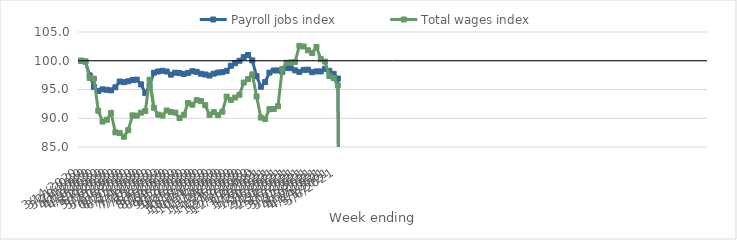
| Category | Payroll jobs index | Total wages index |
|---|---|---|
| 14/03/2020 | 100 | 100 |
| 21/03/2020 | 99.853 | 99.878 |
| 28/03/2020 | 97.447 | 96.996 |
| 04/04/2020 | 95.452 | 96.903 |
| 11/04/2020 | 94.746 | 91.31 |
| 18/04/2020 | 95.023 | 89.423 |
| 25/04/2020 | 94.951 | 89.736 |
| 02/05/2020 | 94.848 | 90.915 |
| 09/05/2020 | 95.383 | 87.552 |
| 16/05/2020 | 96.383 | 87.419 |
| 23/05/2020 | 96.278 | 86.781 |
| 30/05/2020 | 96.426 | 87.936 |
| 06/06/2020 | 96.658 | 90.496 |
| 13/06/2020 | 96.719 | 90.455 |
| 20/06/2020 | 95.897 | 90.972 |
| 27/06/2020 | 94.369 | 91.252 |
| 04/07/2020 | 95.674 | 96.707 |
| 11/07/2020 | 97.921 | 91.822 |
| 18/07/2020 | 98.134 | 90.632 |
| 25/07/2020 | 98.254 | 90.469 |
| 01/08/2020 | 98.123 | 91.344 |
| 08/08/2020 | 97.587 | 91.09 |
| 15/08/2020 | 97.924 | 90.979 |
| 22/08/2020 | 97.852 | 90.042 |
| 29/08/2020 | 97.711 | 90.594 |
| 05/09/2020 | 97.883 | 92.665 |
| 12/09/2020 | 98.179 | 92.354 |
| 19/09/2020 | 98.065 | 93.158 |
| 26/09/2020 | 97.737 | 93.002 |
| 03/10/2020 | 97.616 | 92.274 |
| 10/10/2020 | 97.427 | 90.592 |
| 17/10/2020 | 97.758 | 91.07 |
| 24/10/2020 | 97.948 | 90.548 |
| 31/10/2020 | 98.018 | 91.136 |
| 07/11/2020 | 98.229 | 93.765 |
| 14/11/2020 | 99.131 | 93.198 |
| 21/11/2020 | 99.566 | 93.607 |
| 28/11/2020 | 99.997 | 94.08 |
| 05/12/2020 | 100.629 | 96.211 |
| 12/12/2020 | 100.998 | 96.81 |
| 19/12/2020 | 100.053 | 97.638 |
| 26/12/2020 | 97.318 | 93.794 |
| 02/01/2021 | 95.472 | 90.121 |
| 09/01/2021 | 96.306 | 89.875 |
| 16/01/2021 | 97.939 | 91.581 |
| 23/01/2021 | 98.307 | 91.606 |
| 30/01/2021 | 98.313 | 92.076 |
| 06/02/2021 | 98.079 | 98.581 |
| 13/02/2021 | 98.755 | 99.647 |
| 20/02/2021 | 98.702 | 99.706 |
| 27/02/2021 | 98.326 | 99.791 |
| 06/03/2021 | 98.058 | 102.59 |
| 13/03/2021 | 98.417 | 102.482 |
| 20/03/2021 | 98.442 | 101.82 |
| 27/03/2021 | 98.009 | 101.335 |
| 03/04/2021 | 98.145 | 102.402 |
| 10/04/2021 | 98.146 | 100.284 |
| 17/04/2021 | 98.593 | 99.848 |
| 24/04/2021 | 98.24 | 97.346 |
| 01/05/2021 | 97.726 | 96.993 |
| 08/05/2021 | 96.908 | 95.703 |